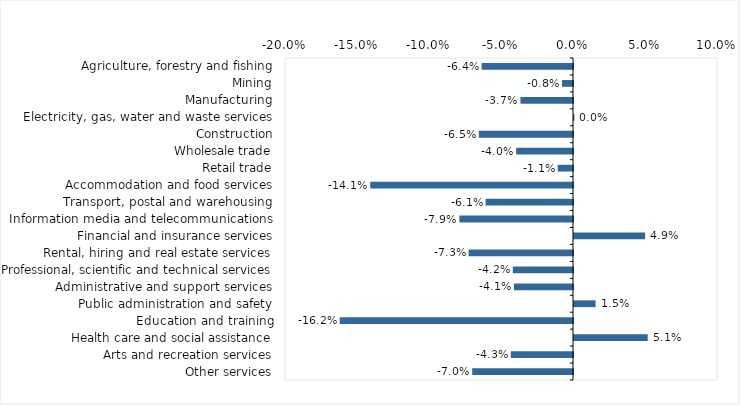
| Category | This week |
|---|---|
| Agriculture, forestry and fishing | -0.064 |
| Mining | -0.008 |
| Manufacturing | -0.036 |
| Electricity, gas, water and waste services | 0 |
| Construction | -0.065 |
| Wholesale trade | -0.04 |
| Retail trade | -0.011 |
| Accommodation and food services | -0.141 |
| Transport, postal and warehousing | -0.061 |
| Information media and telecommunications | -0.079 |
| Financial and insurance services | 0.049 |
| Rental, hiring and real estate services | -0.072 |
| Professional, scientific and technical services | -0.042 |
| Administrative and support services | -0.041 |
| Public administration and safety | 0.015 |
| Education and training | -0.162 |
| Health care and social assistance | 0.051 |
| Arts and recreation services | -0.043 |
| Other services | -0.07 |